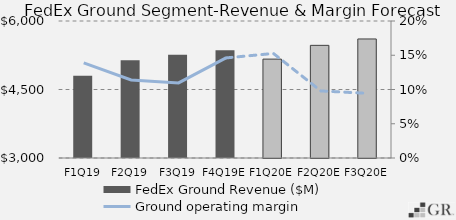
| Category | FedEx Ground Revenue ($M) |
|---|---|
|  F1Q19  | 4798.91 |
|  F2Q19  | 5141.812 |
|  F3Q19  | 5260.927 |
|  F4Q19E  | 5357.591 |
|  F1Q20E  | 5165.621 |
|  F2Q20E  | 5466.589 |
|  F3Q20E  | 5606.757 |